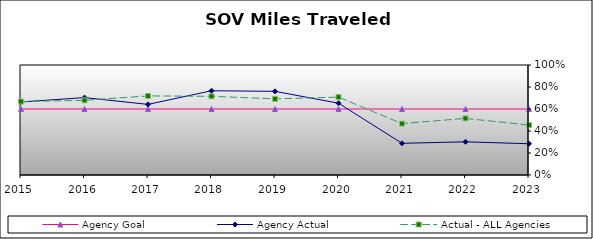
| Category | Agency Goal | Agency Actual | Actual - ALL Agencies |
|---|---|---|---|
| 2015.0 | 0.6 | 0.664 | 0.668 |
| 2016.0 | 0.6 | 0.704 | 0.679 |
| 2017.0 | 0.6 | 0.642 | 0.719 |
| 2018.0 | 0.6 | 0.766 | 0.715 |
| 2019.0 | 0.6 | 0.761 | 0.692 |
| 2020.0 | 0.6 | 0.653 | 0.708 |
| 2021.0 | 0.6 | 0.288 | 0.467 |
| 2022.0 | 0.6 | 0.302 | 0.515 |
| 2023.0 | 0.6 | 0.284 | 0.454 |